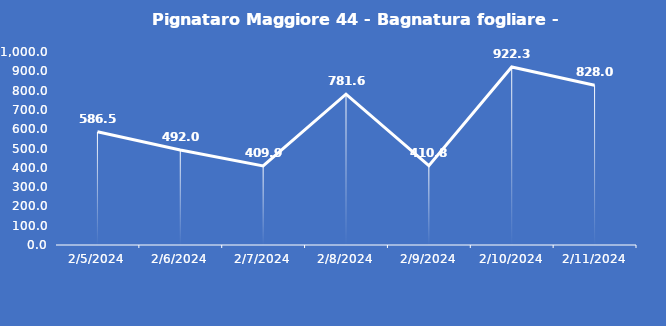
| Category | Pignataro Maggiore 44 - Bagnatura fogliare - Grezzo (min) |
|---|---|
| 2/5/24 | 586.5 |
| 2/6/24 | 492 |
| 2/7/24 | 409.9 |
| 2/8/24 | 781.6 |
| 2/9/24 | 410.8 |
| 2/10/24 | 922.3 |
| 2/11/24 | 828 |